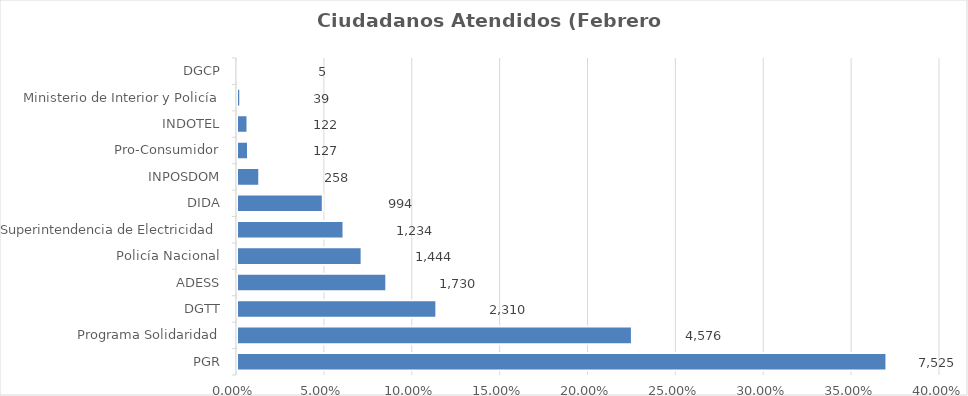
| Category | Porcentaje |
|---|---|
| PGR | 0.37 |
| Programa Solidaridad | 0.225 |
| DGTT | 0.113 |
| ADESS | 0.085 |
| Policía Nacional | 0.071 |
| Superintendencia de Electricidad | 0.061 |
| DIDA | 0.049 |
| INPOSDOM | 0.013 |
| Pro-Consumidor | 0.006 |
| INDOTEL | 0.006 |
| Ministerio de Interior y Policía | 0.002 |
| DGCP | 0 |